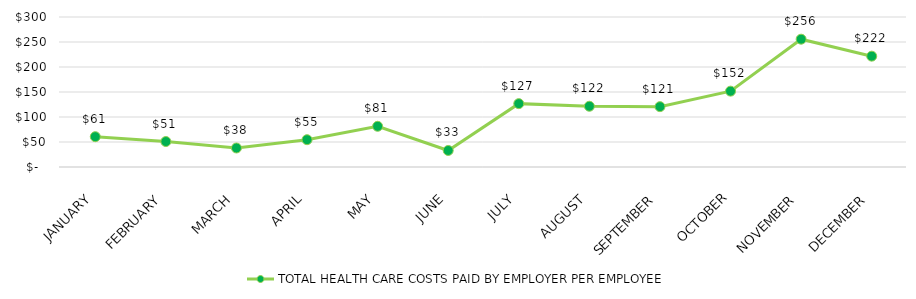
| Category | TOTAL HEALTH CARE COSTS PAID BY EMPLOYER PER EMPLOYEE |
|---|---|
| JANUARY | 60.603 |
| FEBRUARY | 50.933 |
| MARCH | 38.01 |
| APRIL | 54.622 |
| MAY | 81.429 |
| JUNE | 33.067 |
| JULY | 126.72 |
| AUGUST | 121.514 |
| SEPTEMBER | 120.711 |
| OCTOBER | 151.694 |
| NOVEMBER | 255.6 |
| DECEMBER | 221.66 |